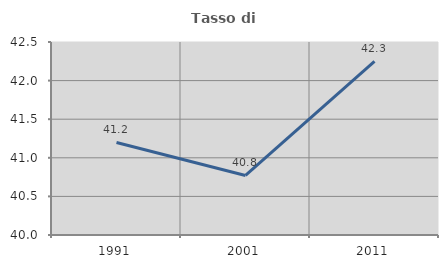
| Category | Tasso di occupazione   |
|---|---|
| 1991.0 | 41.199 |
| 2001.0 | 40.771 |
| 2011.0 | 42.251 |